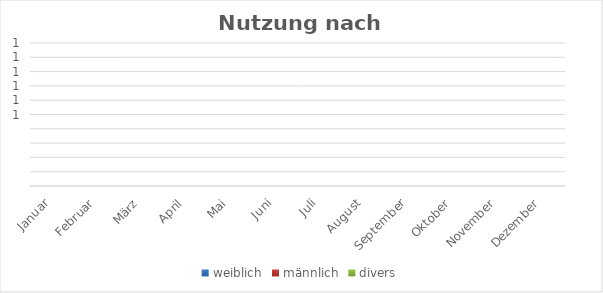
| Category | weiblich | männlich | divers |
|---|---|---|---|
| Januar | 0 | 0 | 0 |
| Februar | 0 | 0 | 0 |
| März | 0 | 0 | 0 |
| April | 0 | 0 | 0 |
| Mai | 0 | 0 | 0 |
| Juni | 0 | 0 | 0 |
| Juli | 0 | 0 | 0 |
| August | 0 | 0 | 0 |
| September | 0 | 0 | 0 |
| Oktober | 0 | 0 | 0 |
| November | 0 | 0 | 0 |
| Dezember | 0 | 0 | 0 |